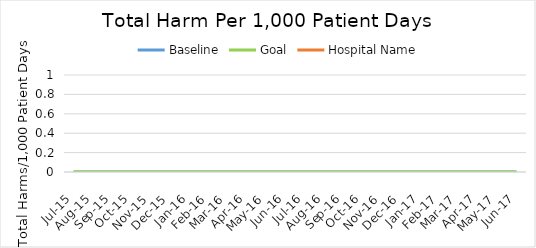
| Category | Baseline | Goal | Hospital Name |
|---|---|---|---|
| 2015-07-01 | 0 | 0 |  |
| 2015-08-01 | 0 | 0 |  |
| 2015-09-01 | 0 | 0 |  |
| 2015-10-01 | 0 | 0 |  |
| 2015-11-01 | 0 | 0 |  |
| 2015-12-01 | 0 | 0 |  |
| 2016-01-01 | 0 | 0 |  |
| 2016-02-01 | 0 | 0 |  |
| 2016-03-01 | 0 | 0 |  |
| 2016-04-01 | 0 | 0 |  |
| 2016-05-01 | 0 | 0 |  |
| 2016-06-01 | 0 | 0 |  |
| 2016-07-01 | 0 | 0 |  |
| 2016-08-01 | 0 | 0 |  |
| 2016-09-01 | 0 | 0 |  |
| 2016-10-01 | 0 | 0 |  |
| 2016-11-01 | 0 | 0 |  |
| 2016-12-01 | 0 | 0 |  |
| 2017-01-01 | 0 | 0 |  |
| 2017-02-01 | 0 | 0 |  |
| 2017-03-01 | 0 | 0 |  |
| 2017-04-01 | 0 | 0 |  |
| 2017-05-01 | 0 | 0 |  |
| 2017-06-01 | 0 | 0 |  |